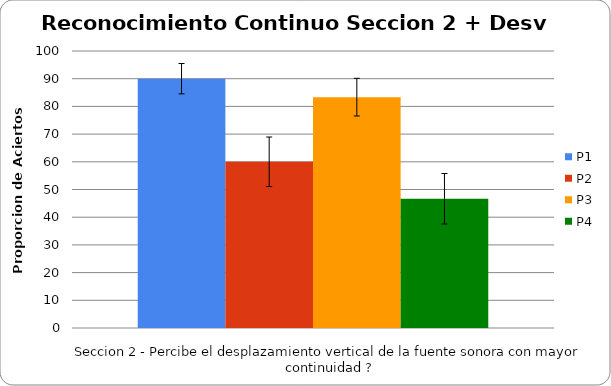
| Category | P1 | P2 | P3 | P4 |
|---|---|---|---|---|
| 0 | 90 | 60 | 83.333 | 46.667 |